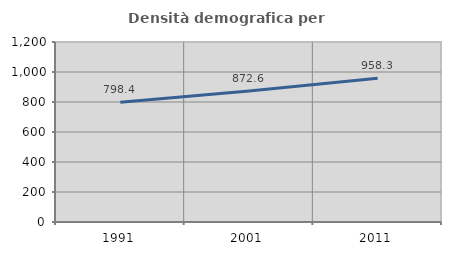
| Category | Densità demografica |
|---|---|
| 1991.0 | 798.355 |
| 2001.0 | 872.64 |
| 2011.0 | 958.336 |